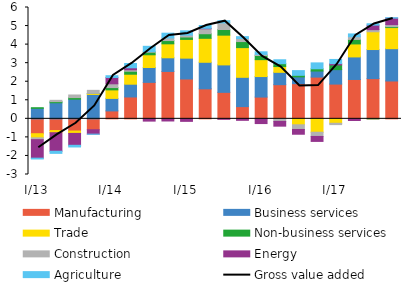
| Category | Manufacturing | Business services | Trade | Non-business services | Construction | Energy | Agriculture |
|---|---|---|---|---|---|---|---|
| I/13 | -0.802 | 0.565 | -0.222 | 0.034 | -0.098 | -0.997 | -0.045 |
| II | -0.633 | 0.867 | -0.115 | 0.061 | 0.07 | -0.999 | -0.115 |
| III | -0.658 | 1.06 | -0.128 | 0.084 | 0.141 | -0.641 | -0.09 |
|  IV | -0.588 | 1.314 | 0.053 | 0.002 | 0.166 | -0.238 | -0.006 |
| I/14 | 0.427 | 0.674 | 0.46 | 0.124 | 0.204 | 0.341 | 0.094 |
| II | 1.179 | 0.688 | 0.538 | 0.16 | 0.077 | 0.109 | 0.231 |
| III | 1.965 | 0.802 | 0.685 | 0.138 | 0.036 | -0.123 | 0.282 |
|  IV | 2.554 | 0.736 | 0.753 | 0.175 | 0.139 | -0.116 | 0.259 |
| I/15 | 2.148 | 1.123 | 1.009 | 0.13 | 0.1 | -0.136 | 0.232 |
| II | 1.617 | 1.431 | 1.292 | 0.247 | 0.266 | 0.027 | 0.152 |
| III | 1.427 | 1.48 | 1.603 | 0.304 | 0.356 | -0.025 | 0.121 |
| IV | 0.659 | 1.579 | 1.601 | 0.326 | 0.165 | -0.081 | 0.1 |
| I/16 | 1.173 | 1.106 | 0.91 | 0.223 | 0.06 | -0.255 | 0.14 |
| II | 1.841 | 0.666 | 0.311 | 0.154 | -0.139 | -0.256 | 0.211 |
| III | 1.895 | 0.365 | -0.321 | 0.084 | -0.252 | -0.257 | 0.254 |
| IV | 2.25 | 0.326 | -0.723 | 0.121 | -0.227 | -0.267 | 0.319 |
| I/17 | 1.873 | 0.778 | -0.24 | 0.253 | -0.072 | 0.071 | 0.225 |
| II | 2.122 | 1.215 | 0.701 | 0.242 | 0.147 | -0.089 | 0.15 |
| III | 2.168 | 1.567 | 0.958 | 0 | 0.113 | 0.245 | 0.074 |
| IV | 2.04 | 1.741 | 1.139 | 0.048 | 0.111 | 0.351 | 0.019 |